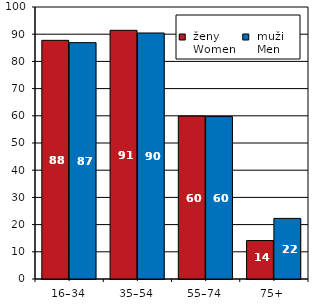
| Category |  ženy 
 Women |  muži 
 Men |
|---|---|---|
| 16–34 | 87.745 | 86.894 |
| 35–54 | 91.425 | 90.442 |
| 55–74 | 59.886 | 59.71 |
| 75+ | 14.132 | 22.278 |